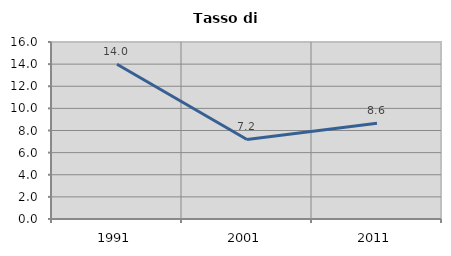
| Category | Tasso di disoccupazione   |
|---|---|
| 1991.0 | 13.99 |
| 2001.0 | 7.193 |
| 2011.0 | 8.649 |